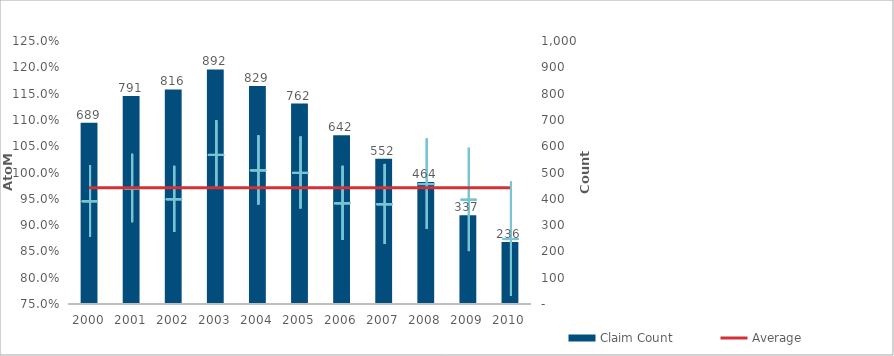
| Category | Claim Count |
|---|---|
| 0 | 689 |
| 1 | 791 |
| 2 | 816 |
| 3 | 892 |
| 4 | 829 |
| 5 | 762 |
| 6 | 642 |
| 7 | 552 |
| 8 | 464 |
| 9 | 337 |
| 10 | 236 |